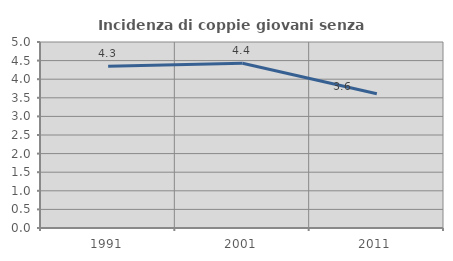
| Category | Incidenza di coppie giovani senza figli |
|---|---|
| 1991.0 | 4.348 |
| 2001.0 | 4.43 |
| 2011.0 | 3.607 |